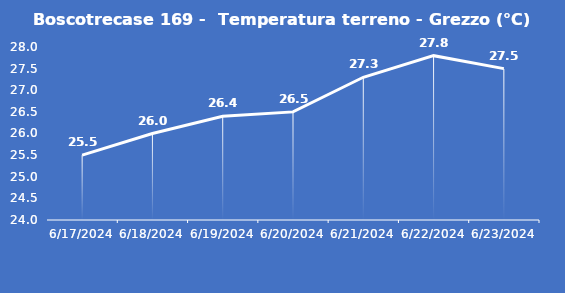
| Category | Boscotrecase 169 -  Temperatura terreno - Grezzo (°C) |
|---|---|
| 6/17/24 | 25.5 |
| 6/18/24 | 26 |
| 6/19/24 | 26.4 |
| 6/20/24 | 26.5 |
| 6/21/24 | 27.3 |
| 6/22/24 | 27.8 |
| 6/23/24 | 27.5 |